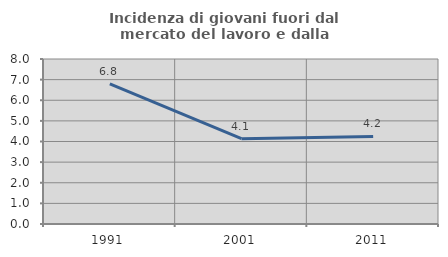
| Category | Incidenza di giovani fuori dal mercato del lavoro e dalla formazione  |
|---|---|
| 1991.0 | 6.793 |
| 2001.0 | 4.134 |
| 2011.0 | 4.246 |